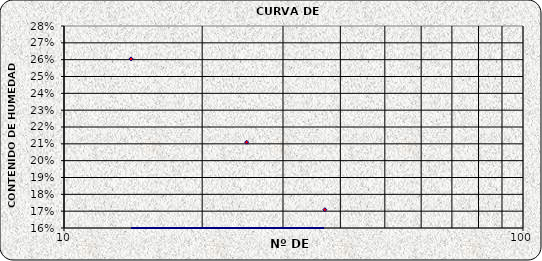
| Category | Series 0 |
|---|---|
| 37.0 | 0.171 |
| 25.0 | 0.211 |
| 14.0 | 0.26 |